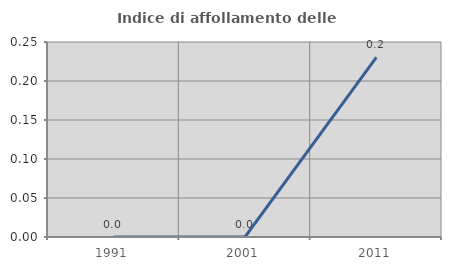
| Category | Indice di affollamento delle abitazioni  |
|---|---|
| 1991.0 | 0 |
| 2001.0 | 0 |
| 2011.0 | 0.23 |